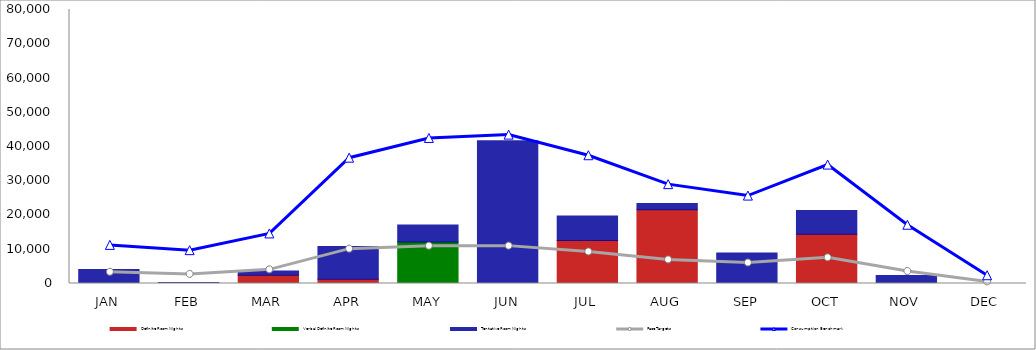
| Category | Definite Room Nights | Verbal Definite Room Nights | Tentative Room Nights |
|---|---|---|---|
| JAN | 0 | 0 | 4088 |
| FEB | 0 | 0 | 295 |
| MAR | 2400 | 0 | 1232 |
| APR | 1205 | 0 | 9632 |
| MAY | 0 | 12090 | 4995 |
| JUN | 0 | 0 | 41680 |
| JUL | 12546 | 0 | 7138 |
| AUG | 21550 | 0 | 1835 |
| SEP | 0 | 0 | 8917 |
| OCT | 14355 | 0 | 6932 |
| NOV | 0 | 0 | 2316 |
| DEC | 0 | 0 | 0 |